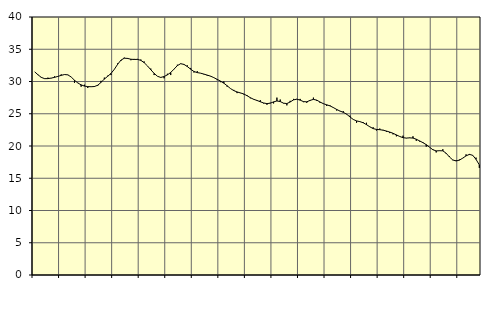
| Category | Piggar | Series 1 |
|---|---|---|
| nan | 31.5 | 31.5 |
| 87.0 | 31 | 31.04 |
| 87.0 | 30.7 | 30.64 |
| 87.0 | 30.4 | 30.44 |
| nan | 30.6 | 30.45 |
| 88.0 | 30.5 | 30.53 |
| 88.0 | 30.8 | 30.64 |
| 88.0 | 30.8 | 30.79 |
| nan | 31.1 | 30.95 |
| 89.0 | 31.1 | 31.08 |
| 89.0 | 31 | 31.03 |
| 89.0 | 30.7 | 30.7 |
| nan | 29.8 | 30.2 |
| 90.0 | 29.8 | 29.77 |
| 90.0 | 29.2 | 29.48 |
| 90.0 | 29.5 | 29.29 |
| nan | 29 | 29.21 |
| 91.0 | 29.2 | 29.19 |
| 91.0 | 29.3 | 29.22 |
| 91.0 | 29.3 | 29.42 |
| nan | 30.1 | 29.86 |
| 92.0 | 30.6 | 30.38 |
| 92.0 | 30.9 | 30.8 |
| 92.0 | 31 | 31.25 |
| nan | 31.9 | 31.88 |
| 93.0 | 32.8 | 32.66 |
| 93.0 | 33.2 | 33.31 |
| 93.0 | 33.7 | 33.61 |
| nan | 33.5 | 33.58 |
| 94.0 | 33.3 | 33.45 |
| 94.0 | 33.5 | 33.42 |
| 94.0 | 33.5 | 33.43 |
| nan | 33.4 | 33.28 |
| 95.0 | 33.1 | 32.92 |
| 95.0 | 32.4 | 32.41 |
| 95.0 | 32 | 31.82 |
| nan | 31 | 31.26 |
| 96.0 | 30.8 | 30.81 |
| 96.0 | 30.6 | 30.63 |
| 96.0 | 30.5 | 30.77 |
| nan | 31.2 | 31.03 |
| 97.0 | 31 | 31.4 |
| 97.0 | 31.9 | 31.92 |
| 97.0 | 32.6 | 32.46 |
| nan | 32.8 | 32.76 |
| 98.0 | 32.6 | 32.65 |
| 98.0 | 32.5 | 32.32 |
| 98.0 | 32.1 | 31.91 |
| nan | 31.4 | 31.55 |
| 99.0 | 31.6 | 31.38 |
| 99.0 | 31.3 | 31.29 |
| 99.0 | 31.1 | 31.15 |
| nan | 30.9 | 30.99 |
| 0.0 | 30.8 | 30.83 |
| 0.0 | 30.6 | 30.6 |
| 0.0 | 30.2 | 30.33 |
| nan | 29.9 | 30.06 |
| 1.0 | 30 | 29.74 |
| 1.0 | 29.2 | 29.34 |
| 1.0 | 28.9 | 28.91 |
| nan | 28.7 | 28.59 |
| 2.0 | 28.2 | 28.38 |
| 2.0 | 28.2 | 28.23 |
| 2.0 | 28 | 28.07 |
| nan | 27.9 | 27.8 |
| 3.0 | 27.4 | 27.49 |
| 3.0 | 27.2 | 27.24 |
| 3.0 | 27.1 | 27.06 |
| nan | 27.1 | 26.86 |
| 4.0 | 26.6 | 26.67 |
| 4.0 | 26.4 | 26.57 |
| 4.0 | 26.7 | 26.64 |
| nan | 26.6 | 26.84 |
| 5.0 | 27.5 | 26.98 |
| 5.0 | 27.2 | 26.89 |
| 5.0 | 26.6 | 26.64 |
| nan | 26.3 | 26.58 |
| 6.0 | 27 | 26.82 |
| 6.0 | 27.3 | 27.15 |
| 6.0 | 27.3 | 27.26 |
| nan | 27.3 | 27.11 |
| 7.0 | 26.8 | 26.88 |
| 7.0 | 26.7 | 26.85 |
| 7.0 | 27 | 27.07 |
| nan | 27.5 | 27.23 |
| 8.0 | 27 | 27.11 |
| 8.0 | 26.7 | 26.82 |
| 8.0 | 26.6 | 26.56 |
| nan | 26.2 | 26.39 |
| 9.0 | 26.3 | 26.22 |
| 9.0 | 26 | 25.96 |
| 9.0 | 25.5 | 25.67 |
| nan | 25.4 | 25.42 |
| 10.0 | 25.4 | 25.22 |
| 10.0 | 24.9 | 24.94 |
| 10.0 | 24.7 | 24.51 |
| nan | 24.1 | 24.12 |
| 11.0 | 23.6 | 23.89 |
| 11.0 | 23.8 | 23.78 |
| 11.0 | 23.7 | 23.6 |
| nan | 23.6 | 23.31 |
| 12.0 | 23 | 22.97 |
| 12.0 | 22.9 | 22.7 |
| 12.0 | 22.4 | 22.57 |
| nan | 22.7 | 22.53 |
| 13.0 | 22.5 | 22.45 |
| 13.0 | 22.2 | 22.32 |
| 13.0 | 22 | 22.16 |
| nan | 21.8 | 21.97 |
| 14.0 | 21.5 | 21.72 |
| 14.0 | 21.5 | 21.48 |
| 14.0 | 21.6 | 21.29 |
| nan | 21.2 | 21.23 |
| 15.0 | 21.3 | 21.26 |
| 15.0 | 21.5 | 21.23 |
| 15.0 | 20.8 | 21.05 |
| nan | 20.7 | 20.79 |
| 16.0 | 20.6 | 20.52 |
| 16.0 | 19.9 | 20.21 |
| 16.0 | 19.8 | 19.81 |
| nan | 19.5 | 19.42 |
| 17.0 | 19 | 19.24 |
| 17.0 | 19.3 | 19.27 |
| 17.0 | 19.5 | 19.25 |
| nan | 18.8 | 18.88 |
| 18.0 | 18.4 | 18.29 |
| 18.0 | 17.8 | 17.84 |
| 18.0 | 17.8 | 17.68 |
| nan | 17.9 | 17.81 |
| 19.0 | 18.1 | 18.12 |
| 19.0 | 18.7 | 18.47 |
| 19.0 | 18.6 | 18.7 |
| nan | 18.6 | 18.56 |
| 20.0 | 18.2 | 17.93 |
| 20.0 | 16.6 | 17.07 |